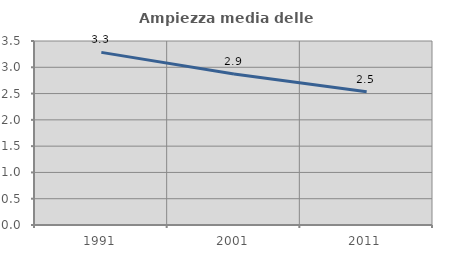
| Category | Ampiezza media delle famiglie |
|---|---|
| 1991.0 | 3.284 |
| 2001.0 | 2.872 |
| 2011.0 | 2.533 |